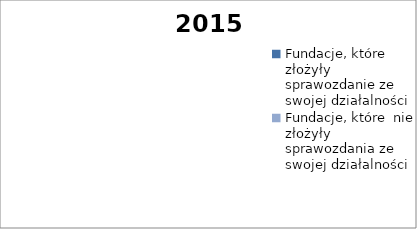
| Category | 2015 |
|---|---|
| Fundacje, które złożyły sprawozdanie ze swojej działalności  | 0 |
| Fundacje, które  nie złożyły sprawozdania ze swojej działalności  | 0 |